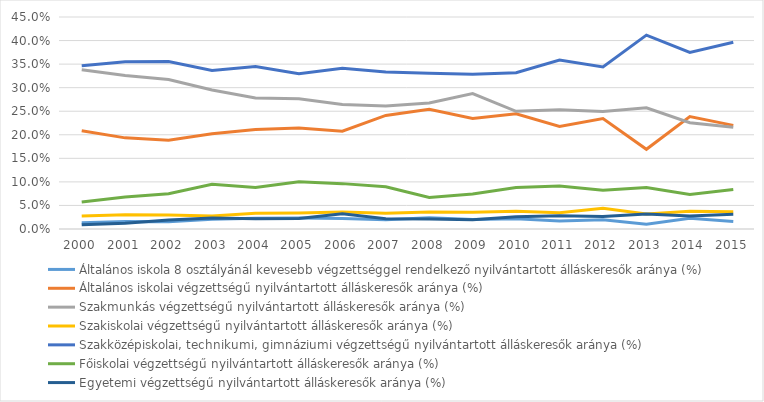
| Category | Általános iskola 8 osztályánál kevesebb végzettséggel rendelkező nyilvántartott álláskeresők aránya (%) | Általános iskolai végzettségű nyilvántartott álláskeresők aránya (%) | Szakmunkás végzettségű nyilvántartott álláskeresők aránya (%) | Szakiskolai végzettségű nyilvántartott álláskeresők aránya (%) | Szakközépiskolai, technikumi, gimnáziumi végzettségű nyilvántartott álláskeresők aránya (%) | Főiskolai végzettségű nyilvántartott álláskeresők aránya (%) | Egyetemi végzettségű nyilvántartott álláskeresők aránya (%) |
|---|---|---|---|---|---|---|---|
| 2000.0 | 0.013 | 0.209 | 0.338 | 0.027 | 0.346 | 0.057 | 0.009 |
| 2001.0 | 0.016 | 0.193 | 0.326 | 0.03 | 0.355 | 0.068 | 0.012 |
| 2002.0 | 0.015 | 0.188 | 0.317 | 0.03 | 0.355 | 0.075 | 0.019 |
| 2003.0 | 0.021 | 0.202 | 0.295 | 0.027 | 0.337 | 0.095 | 0.023 |
| 2004.0 | 0.023 | 0.211 | 0.278 | 0.033 | 0.345 | 0.088 | 0.022 |
| 2005.0 | 0.023 | 0.214 | 0.276 | 0.034 | 0.33 | 0.1 | 0.022 |
| 2006.0 | 0.022 | 0.208 | 0.264 | 0.036 | 0.341 | 0.096 | 0.032 |
| 2007.0 | 0.02 | 0.241 | 0.261 | 0.033 | 0.333 | 0.09 | 0.022 |
| 2008.0 | 0.024 | 0.254 | 0.268 | 0.036 | 0.33 | 0.067 | 0.021 |
| 2009.0 | 0.02 | 0.235 | 0.287 | 0.035 | 0.329 | 0.074 | 0.02 |
| 2010.0 | 0.022 | 0.245 | 0.25 | 0.038 | 0.332 | 0.088 | 0.026 |
| 2011.0 | 0.017 | 0.218 | 0.253 | 0.035 | 0.359 | 0.091 | 0.028 |
| 2012.0 | 0.02 | 0.234 | 0.249 | 0.044 | 0.344 | 0.082 | 0.027 |
| 2013.0 | 0.01 | 0.169 | 0.257 | 0.032 | 0.412 | 0.088 | 0.032 |
| 2014.0 | 0.023 | 0.239 | 0.226 | 0.038 | 0.375 | 0.073 | 0.028 |
| 2015.0 | 0.016 | 0.22 | 0.216 | 0.036 | 0.397 | 0.084 | 0.031 |